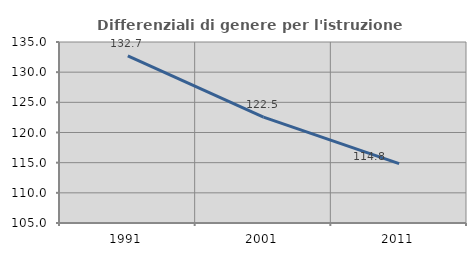
| Category | Differenziali di genere per l'istruzione superiore |
|---|---|
| 1991.0 | 132.693 |
| 2001.0 | 122.541 |
| 2011.0 | 114.829 |